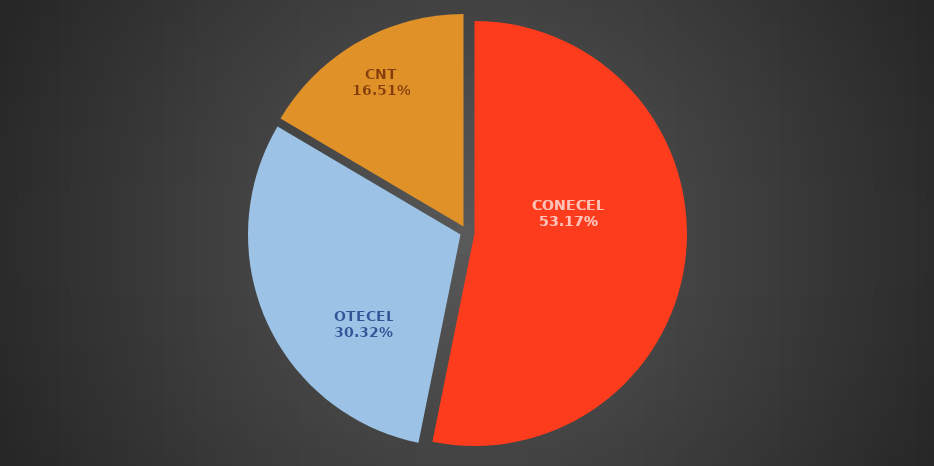
| Category | Abr 2018 |
|---|---|
| CONECEL | 8036850 |
| OTECEL | 4582050 |
| CNT | 2495597 |